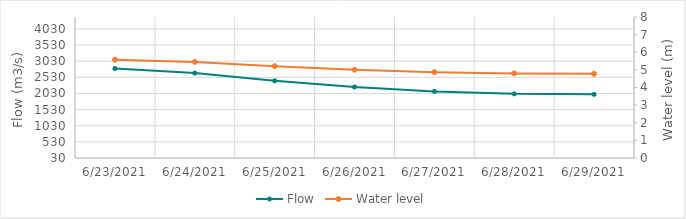
| Category | Flow |
|---|---|
| 6/6/21 | 4147.07 |
| 6/5/21 | 4234.87 |
| 6/4/21 | 4219.22 |
| 6/3/21 | 3876.08 |
| 6/2/21 | 3561.24 |
| 6/1/21 | 3512.96 |
| 5/31/21 | 3456.77 |